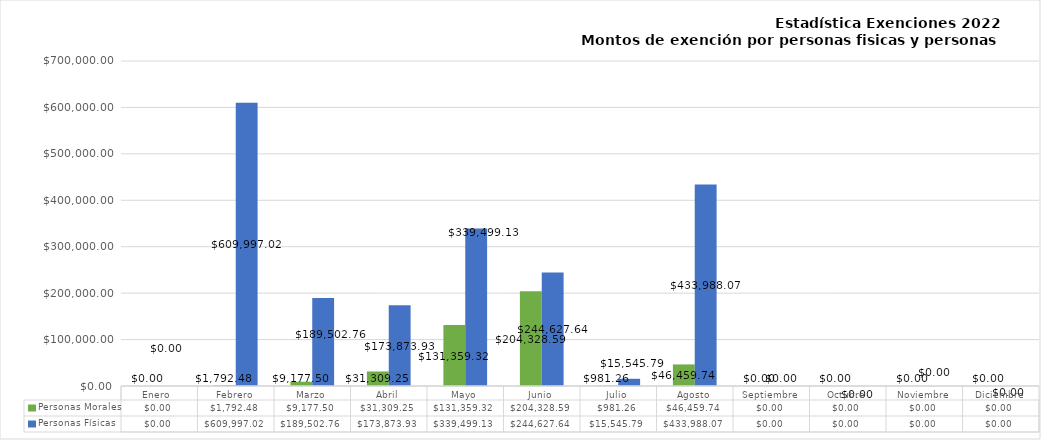
| Category | Personas Morales | Personas Físicas |
|---|---|---|
| Enero  | 0 | 0 |
| Febrero | 1792.48 | 609997.02 |
| Marzo | 9177.5 | 189502.76 |
| Abril | 31309.25 | 173873.93 |
| Mayo | 131359.32 | 339499.13 |
| Junio | 204328.59 | 244627.64 |
| Julio | 981.26 | 15545.79 |
| Agosto | 46459.74 | 433988.07 |
| Septiembre | 0 | 0 |
| Octubre | 0 | 0 |
| Noviembre | 0 | 0 |
| Diciembre | 0 | 0 |